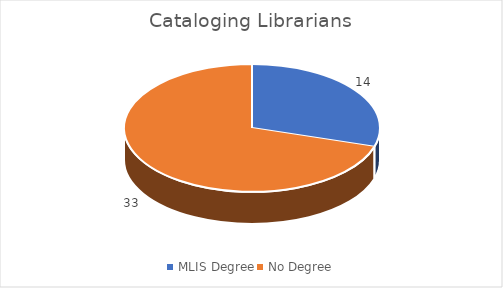
| Category | Series 0 |
|---|---|
| MLIS Degree | 14 |
| No Degree | 33 |